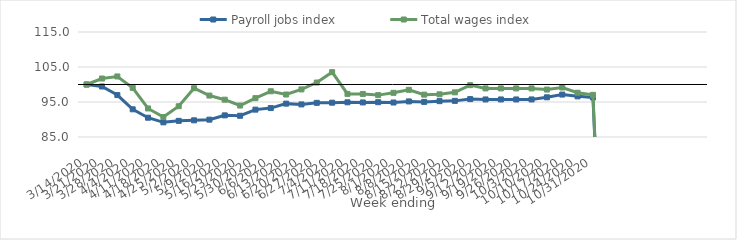
| Category | Payroll jobs index | Total wages index |
|---|---|---|
| 14/03/2020 | 100 | 100 |
| 21/03/2020 | 99.431 | 101.708 |
| 28/03/2020 | 96.982 | 102.301 |
| 04/04/2020 | 92.912 | 99.044 |
| 11/04/2020 | 90.511 | 93.154 |
| 18/04/2020 | 89.19 | 90.716 |
| 25/04/2020 | 89.616 | 93.79 |
| 02/05/2020 | 89.764 | 98.937 |
| 09/05/2020 | 89.955 | 96.843 |
| 16/05/2020 | 91.179 | 95.657 |
| 23/05/2020 | 91.07 | 93.995 |
| 30/05/2020 | 92.821 | 96.102 |
| 06/06/2020 | 93.263 | 98.067 |
| 13/06/2020 | 94.535 | 97.139 |
| 20/06/2020 | 94.312 | 98.606 |
| 27/06/2020 | 94.762 | 100.559 |
| 04/07/2020 | 94.803 | 103.519 |
| 11/07/2020 | 94.911 | 97.315 |
| 18/07/2020 | 94.87 | 97.295 |
| 25/07/2020 | 94.943 | 96.967 |
| 01/08/2020 | 94.849 | 97.619 |
| 08/08/2020 | 95.169 | 98.48 |
| 15/08/2020 | 95.028 | 97.105 |
| 22/08/2020 | 95.241 | 97.197 |
| 29/08/2020 | 95.323 | 97.757 |
| 05/09/2020 | 95.825 | 99.812 |
| 12/09/2020 | 95.729 | 98.882 |
| 19/09/2020 | 95.729 | 98.882 |
| 26/09/2020 | 95.729 | 98.882 |
| 03/10/2020 | 95.729 | 98.882 |
| 10/10/2020 | 96.342 | 98.558 |
| 17/10/2020 | 97.128 | 99.143 |
| 24/10/2020 | 96.61 | 97.643 |
| 31/10/2020 | 96.29 | 97.042 |